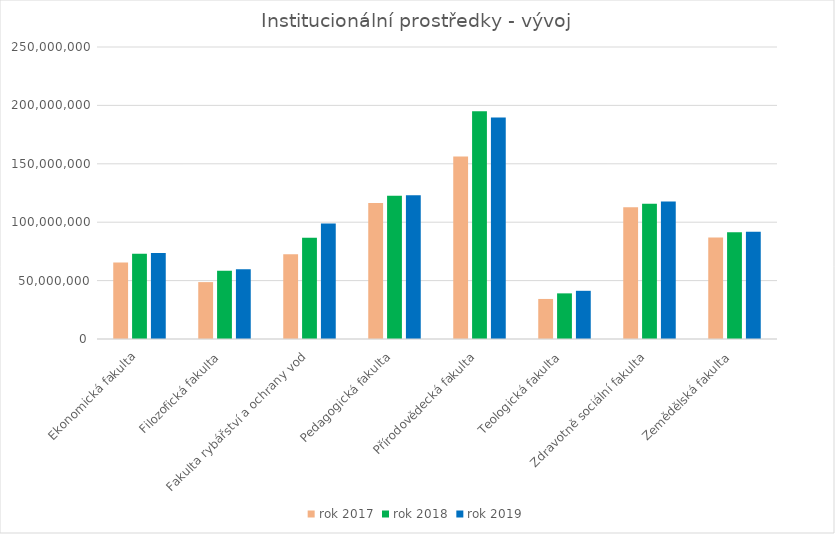
| Category | rok 2017 | rok 2018 | rok 2019 |
|---|---|---|---|
| Ekonomická fakulta | 65545566 | 72986482 | 73671227 |
| Filozofická fakulta | 48706732 | 58437728 | 59704375 |
| Fakulta rybářství a ochrany vod | 72599544 | 86666544 | 98986568 |
| Pedagogická fakulta | 116453876 | 122644576 | 123088365 |
| Přírodovědecká fakulta | 156333880 | 194889640 | 189693042 |
| Teologická fakulta | 34284167 | 39073688 | 41265899 |
| Zdravotně sociální fakulta | 112788730 | 115783919 | 117651532 |
| Zemědělská fakulta | 86884300 | 91385251 | 91755554 |